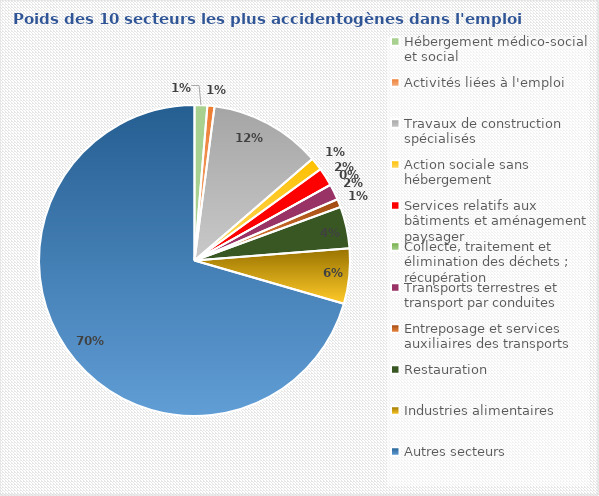
| Category | Series 0 |
|---|---|
| Hébergement médico-social et social | 0.013 |
| Activités liées à l'emploi | 0.007 |
| Travaux de construction spécialisés | 0.116 |
| Action sociale sans hébergement | 0.013 |
| Services relatifs aux bâtiments et aménagement paysager | 0.019 |
| Collecte, traitement et élimination des déchets ; récupération | 0 |
| Transports terrestres et transport par conduites | 0.016 |
| Entreposage et services auxiliaires des transports | 0.008 |
| Restauration | 0.043 |
| Industries alimentaires | 0.057 |
| Autres secteurs | 0.704 |